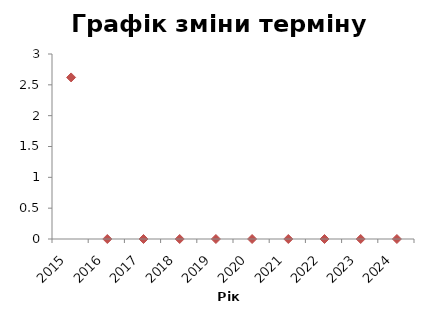
| Category | Series 0 |
|---|---|
| 2015.0 | 2.62 |
| 2016.0 | 0 |
| 2017.0 | 0 |
| 2018.0 | 0 |
| 2019.0 | 0 |
| 2020.0 | 0 |
| 2021.0 | 0 |
| 2022.0 | 0 |
| 2023.0 | 0 |
| 2024.0 | 0 |